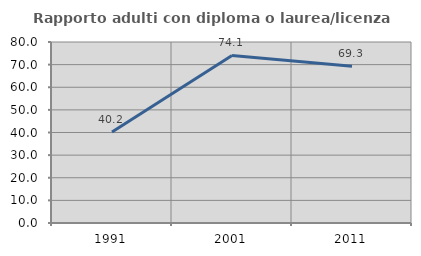
| Category | Rapporto adulti con diploma o laurea/licenza media  |
|---|---|
| 1991.0 | 40.193 |
| 2001.0 | 74.074 |
| 2011.0 | 69.27 |